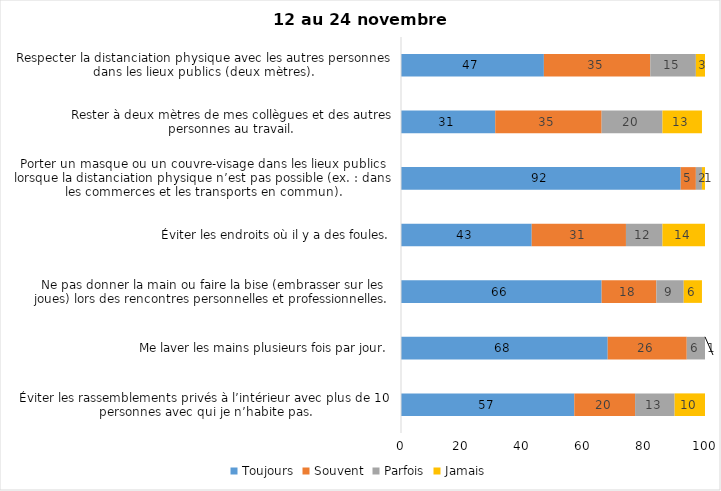
| Category | Toujours | Souvent | Parfois | Jamais |
|---|---|---|---|---|
| Éviter les rassemblements privés à l’intérieur avec plus de 10 personnes avec qui je n’habite pas. | 57 | 20 | 13 | 10 |
| Me laver les mains plusieurs fois par jour. | 68 | 26 | 6 | 1 |
| Ne pas donner la main ou faire la bise (embrasser sur les joues) lors des rencontres personnelles et professionnelles. | 66 | 18 | 9 | 6 |
| Éviter les endroits où il y a des foules. | 43 | 31 | 12 | 14 |
| Porter un masque ou un couvre-visage dans les lieux publics lorsque la distanciation physique n’est pas possible (ex. : dans les commerces et les transports en commun). | 92 | 5 | 2 | 1 |
| Rester à deux mètres de mes collègues et des autres personnes au travail. | 31 | 35 | 20 | 13 |
| Respecter la distanciation physique avec les autres personnes dans les lieux publics (deux mètres). | 47 | 35 | 15 | 3 |